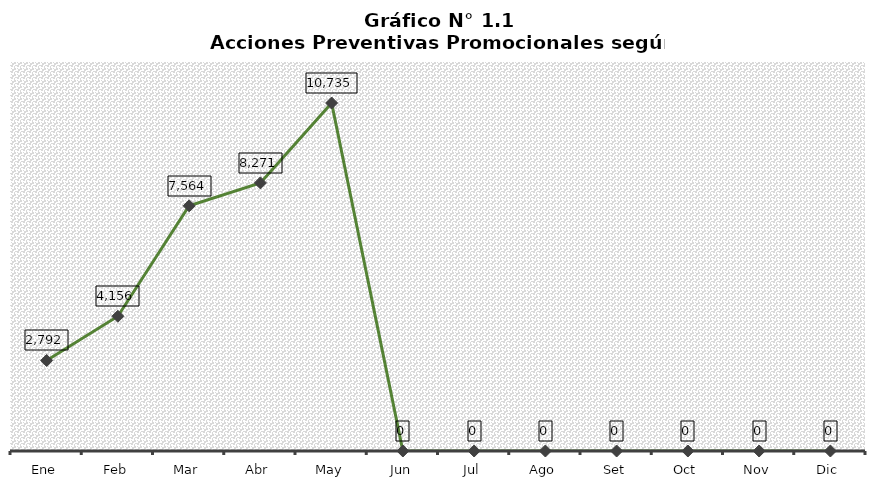
| Category | Series 0 |
|---|---|
| Ene | 2792 |
| Feb | 4156 |
| Mar | 7564 |
| Abr | 8271 |
| May | 10735 |
| Jun | 0 |
| Jul | 0 |
| Ago | 0 |
| Set | 0 |
| Oct | 0 |
| Nov | 0 |
| Dic | 0 |